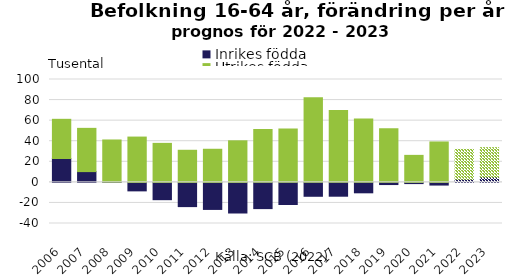
| Category | Inrikes födda | Utrikes födda |
|---|---|---|
| 2006.0 | 23.176 | 38.112 |
| 2007.0 | 10.448 | 42.051 |
| 2008.0 | 0.284 | 40.92 |
| 2009.0 | -8.278 | 44.03 |
| 2010.0 | -16.848 | 37.904 |
| 2011.0 | -23.577 | 31.188 |
| 2012.0 | -26.314 | 32.176 |
| 2013.0 | -29.79 | 40.394 |
| 2014.0 | -25.521 | 51.363 |
| 2015.0 | -21.522 | 51.889 |
| 2016.0 | -13.535 | 82.366 |
| 2017.0 | -13.469 | 69.904 |
| 2018.0 | -10.165 | 61.688 |
| 2019.0 | -2.136 | 52.225 |
| 2020.0 | -1.198 | 26.234 |
| 2021.0 | -2.629 | 39.282 |
| 2022.0 | 3.046 | 29 |
| 2023.0 | 5.096 | 28.629 |